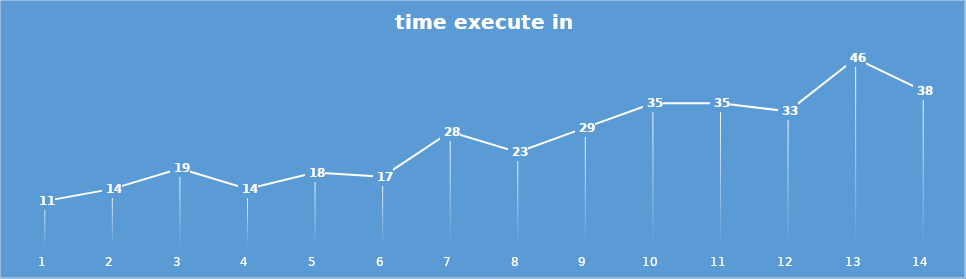
| Category | time execute in console(ms) |
|---|---|
| 0 | 11 |
| 1 | 14 |
| 2 | 19 |
| 3 | 14 |
| 4 | 18 |
| 5 | 17 |
| 6 | 28 |
| 7 | 23 |
| 8 | 29 |
| 9 | 35 |
| 10 | 35 |
| 11 | 33 |
| 12 | 46 |
| 13 | 38 |